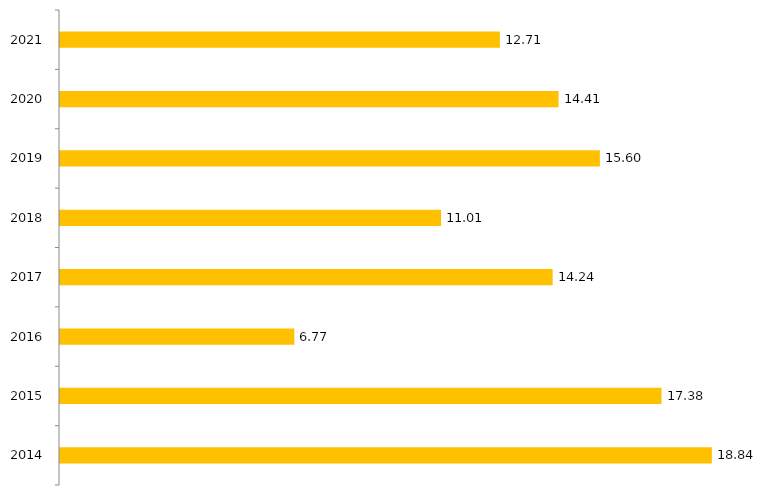
| Category | Series 1 |
|---|---|
| 2014.0 | 18.84 |
| 2015.0 | 17.385 |
| 2016.0 | 6.773 |
| 2017.0 | 14.238 |
| 2018.0 | 11.012 |
| 2019.0 | 15.603 |
| 2020.0 | 14.41 |
| 2021.0 | 12.712 |